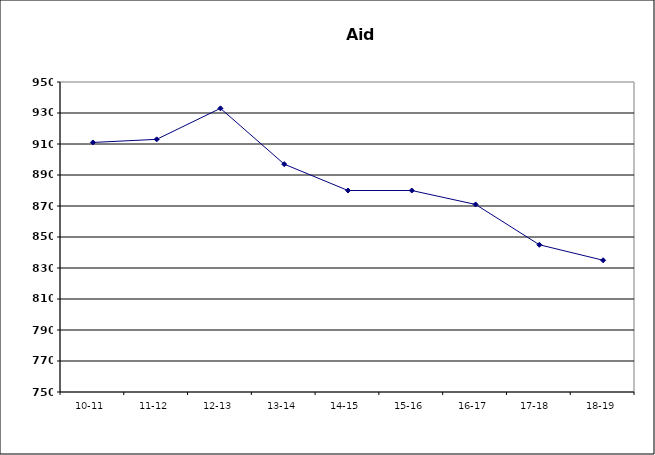
| Category | Series 0 |
|---|---|
| 10-11 | 911 |
| 11-12 | 913 |
| 12-13 | 933 |
| 13-14 | 897 |
| 14-15 | 880 |
| 15-16 | 880 |
| 16-17 | 871 |
| 17-18  | 845 |
| 18-19 | 835 |